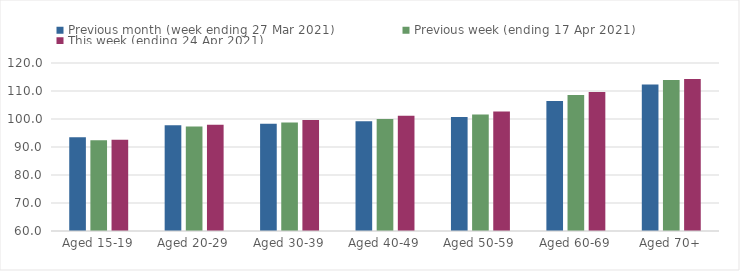
| Category | Previous month (week ending 27 Mar 2021) | Previous week (ending 17 Apr 2021) | This week (ending 24 Apr 2021) |
|---|---|---|---|
| Aged 15-19 | 93.49 | 92.38 | 92.62 |
| Aged 20-29 | 97.75 | 97.36 | 97.93 |
| Aged 30-39 | 98.3 | 98.73 | 99.67 |
| Aged 40-49 | 99.22 | 100.02 | 101.18 |
| Aged 50-59 | 100.67 | 101.63 | 102.7 |
| Aged 60-69 | 106.41 | 108.55 | 109.68 |
| Aged 70+ | 112.35 | 113.94 | 114.31 |